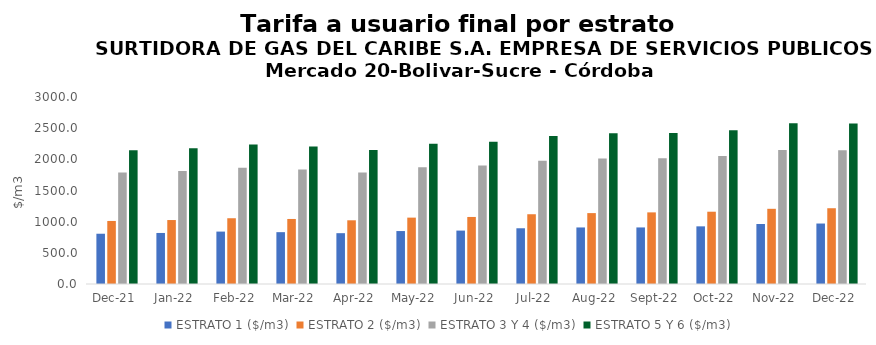
| Category | ESTRATO 1 ($/m3) | ESTRATO 2 ($/m3) | ESTRATO 3 Y 4 ($/m3) | ESTRATO 5 Y 6 ($/m3) |
|---|---|---|---|---|
| 2021-12-01 | 806.47 | 1011.33 | 1789.2 | 2147.04 |
| 2022-01-01 | 818.77 | 1026.2 | 1814.11 | 2176.932 |
| 2022-02-01 | 840.84 | 1054.98 | 1864.59 | 2237.508 |
| 2022-03-01 | 831.68 | 1043.33 | 1838.57 | 2206.284 |
| 2022-04-01 | 815.29 | 1022.06 | 1790.68 | 2148.816 |
| 2022-05-01 | 849.49 | 1064.9 | 1874.06 | 2248.872 |
| 2022-06-01 | 856.82 | 1075.55 | 1900.19 | 2280.228 |
| 2022-07-01 | 894.13 | 1119.13 | 1978.46 | 2374.152 |
| 2022-08-01 | 907.16 | 1137.37 | 2014.17 | 2417.004 |
| 2022-09-01 | 907.44 | 1149 | 2018.96 | 2422.752 |
| 2022-10-01 | 924.96 | 1159.68 | 2054.17 | 2465.004 |
| 2022-11-01 | 962.82 | 1206.32 | 2147.73 | 2577.276 |
| 2022-12-01 | 970.22 | 1215.6 | 2146.46 | 2575.752 |